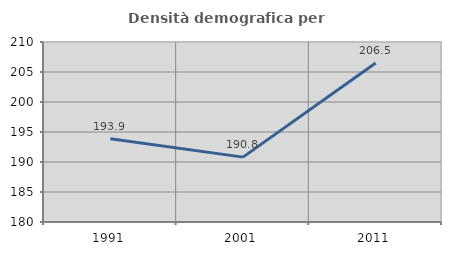
| Category | Densità demografica |
|---|---|
| 1991.0 | 193.884 |
| 2001.0 | 190.812 |
| 2011.0 | 206.497 |